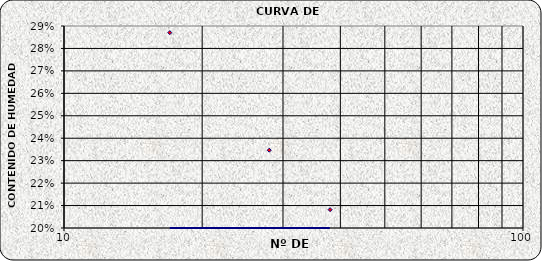
| Category | Series 0 |
|---|---|
| 38.0 | 0.208 |
| 28.0 | 0.235 |
| 17.0 | 0.287 |